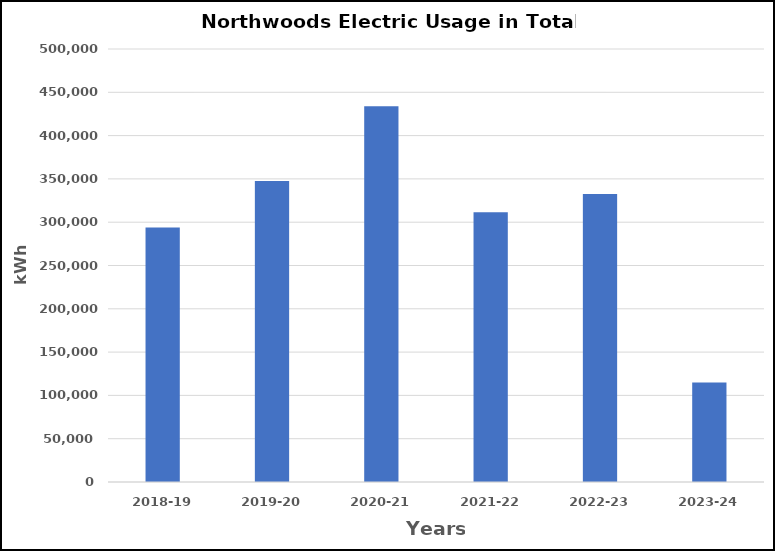
| Category | Series 0 |
|---|---|
| 2018-19 | 294022 |
| 2019-20 | 347576 |
| 2020-21 | 434000 |
| 2021-22 | 311487 |
| 2022-23 | 332476 |
| 2023-24 | 114953 |